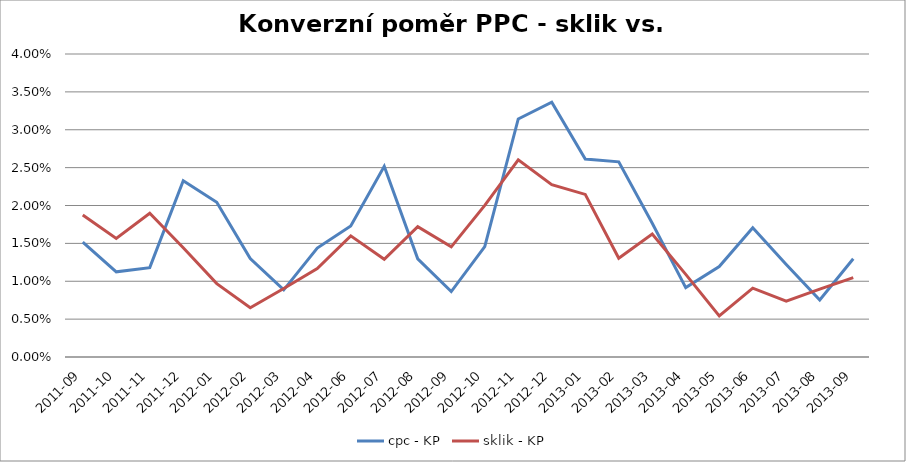
| Category | cpc - KP | sklik - KP |
|---|---|---|
| 2011-09 | 0.015 | 0.019 |
| 2011-10 | 0.011 | 0.016 |
| 2011-11 | 0.012 | 0.019 |
| 2011-12 | 0.023 | 0.014 |
| 2012-01 | 0.02 | 0.01 |
| 2012-02 | 0.013 | 0.007 |
| 2012-03 | 0.009 | 0.009 |
| 2012-04 | 0.014 | 0.012 |
| 2012-06 | 0.017 | 0.016 |
| 2012-07 | 0.025 | 0.013 |
| 2012-08 | 0.013 | 0.017 |
| 2012-09 | 0.009 | 0.015 |
| 2012-10 | 0.015 | 0.02 |
| 2012-11 | 0.031 | 0.026 |
| 2012-12 | 0.034 | 0.023 |
| 2013-01 | 0.026 | 0.021 |
| 2013-02 | 0.026 | 0.013 |
| 2013-03 | 0.018 | 0.016 |
| 2013-04 | 0.009 | 0.011 |
| 2013-05 | 0.012 | 0.005 |
| 2013-06 | 0.017 | 0.009 |
| 2013-07 | 0.012 | 0.007 |
| 2013-08 | 0.008 | 0.009 |
| 2013-09 | 0.013 | 0.01 |